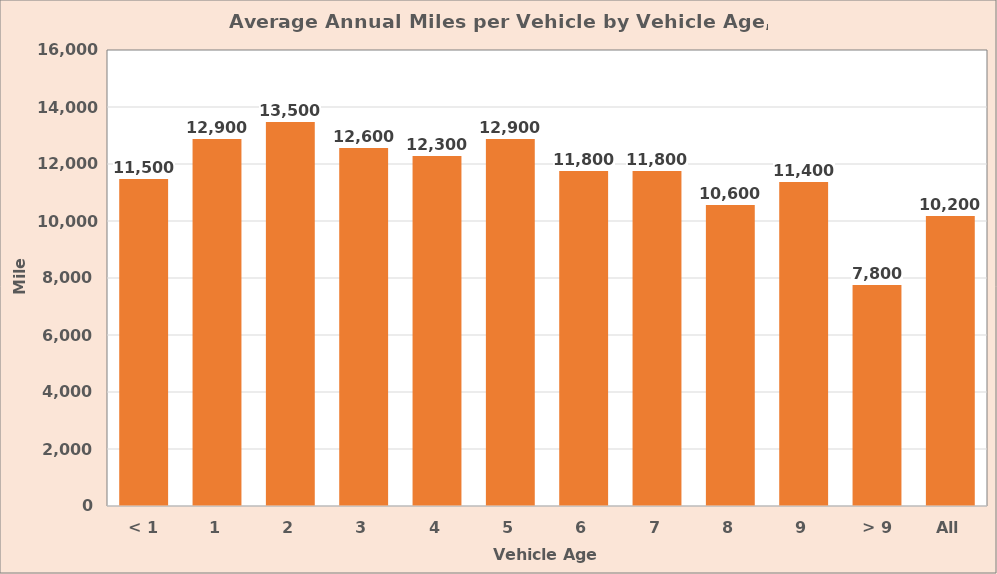
| Category | Average Annual Miles per Vehicle |
|---|---|
| < 1 | 11500 |
| 1 | 12900 |
| 2 | 13500 |
| 3 | 12600 |
| 4 | 12300 |
| 5 | 12900 |
| 6 | 11800 |
| 7 | 11800 |
| 8 | 10600 |
| 9 | 11400 |
| > 9 | 7800 |
| All | 10200 |